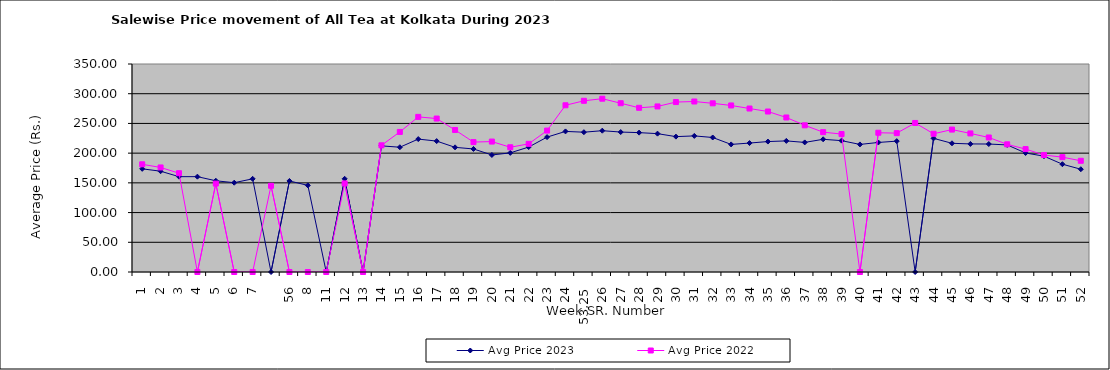
| Category | Avg Price 2023 | Avg Price 2022 |
|---|---|---|
| 1 | 173.609 | 181.211 |
| 2 | 169.604 | 175.908 |
| 3 | 160.428 | 166.252 |
| 4 | 160.416 | 0 |
| 5 | 153.499 | 148.763 |
| 6 | 150.251 | 0 |
| 7 | 156.806 | 0 |
|  | 0 | 145.087 |
| 56 | 153.199 | 0 |
| 8 | 145.759 | 0 |
| 11 | 0 | 0 |
| 12 | 156.807 | 149.085 |
| 13 | 0 | 0 |
| 14 | 212.247 | 213.175 |
| 15 | 209.952 | 235.683 |
| 16 | 223.656 | 261.004 |
| 17 | 220.276 | 258.205 |
| 18 | 209.783 | 238.969 |
| 19 | 207.045 | 218.595 |
| 20 | 196.919 | 219.477 |
| 21 | 200.456 | 209.875 |
| 22 | 210.219 | 215.657 |
| 23 | 226.999 | 237.972 |
| 24 | 236.569 | 280.56 |
| 53,25 | 235.243 | 288.1 |
| 26 | 237.769 | 291.609 |
| 27 | 235.48 | 284.001 |
| 28 | 234.516 | 276.286 |
| 29 | 232.798 | 278.574 |
| 30 | 227.788 | 285.93 |
| 31 | 229.024 | 286.875 |
| 32 | 226.337 | 283.838 |
| 33 | 214.687 | 280.244 |
| 34 | 216.98 | 275.088 |
| 35 | 219.501 | 270.042 |
| 36 | 220.595 | 259.988 |
| 37 | 218.041 | 246.812 |
| 38 | 223.307 | 235.301 |
| 39 | 221.031 | 232.096 |
| 40 | 214.671 | 0 |
| 41 | 217.986 | 234.322 |
| 42 | 220.211 | 233.653 |
| 43 | 0 | 250.779 |
| 44 | 224.889 | 232.589 |
| 45 | 216.576 | 239.652 |
| 46 | 215.516 | 233.166 |
| 47 | 215.355 | 226.373 |
| 48 | 213.814 | 214.846 |
| 49 | 200.252 | 206.802 |
| 50 | 194.889 | 196.84 |
| 51 | 181.396 | 193.251 |
| 52 | 172.949 | 187.139 |